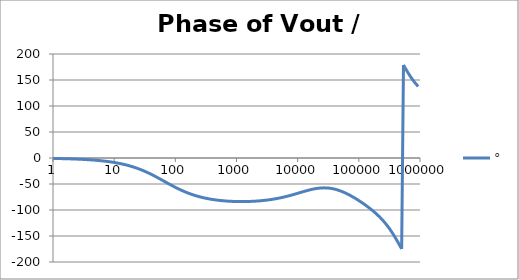
| Category | ° |
|---|---|
| 1.0 | -0.867 |
| 1.0715193052376064 | -0.929 |
| 1.1481536214968828 | -0.996 |
| 1.2302687708123814 | -1.067 |
| 1.318256738556407 | -1.143 |
| 1.4125375446227544 | -1.225 |
| 1.513561248436208 | -1.312 |
| 1.6218100973589298 | -1.406 |
| 1.7378008287493754 | -1.507 |
| 1.8620871366628673 | -1.614 |
| 1.9952623149688797 | -1.73 |
| 2.1379620895022318 | -1.853 |
| 2.2908676527677727 | -1.986 |
| 2.45470891568503 | -2.128 |
| 2.6302679918953817 | -2.28 |
| 2.8183829312644537 | -2.443 |
| 3.0199517204020156 | -2.617 |
| 3.235936569296282 | -2.804 |
| 3.467368504525316 | -3.004 |
| 3.7153522909717256 | -3.219 |
| 3.9810717055349727 | -3.448 |
| 4.265795188015926 | -3.694 |
| 4.570881896148749 | -3.958 |
| 4.897788193684462 | -4.24 |
| 5.2480746024977245 | -4.542 |
| 5.62341325190349 | -4.865 |
| 6.025595860743575 | -5.211 |
| 6.456542290346554 | -5.581 |
| 6.918309709189363 | -5.978 |
| 7.4131024130091765 | -6.402 |
| 7.943282347242814 | -6.855 |
| 8.511380382023765 | -7.34 |
| 9.120108393559095 | -7.859 |
| 9.772372209558105 | -8.413 |
| 10.47128548050899 | -9.005 |
| 11.22018454301963 | -9.637 |
| 12.022644346174127 | -10.312 |
| 12.88249551693134 | -11.032 |
| 13.803842646028851 | -11.799 |
| 14.791083881682074 | -12.617 |
| 15.848931924611136 | -13.487 |
| 16.98243652461744 | -14.412 |
| 18.197008586099834 | -15.395 |
| 19.498445997580447 | -16.438 |
| 20.892961308540382 | -17.543 |
| 22.387211385683386 | -18.713 |
| 23.988329190194897 | -19.948 |
| 25.703957827688622 | -21.249 |
| 27.54228703338165 | -22.619 |
| 29.51209226666385 | -24.057 |
| 31.62277660168379 | -25.562 |
| 33.884415613920254 | -27.133 |
| 36.307805477010106 | -28.769 |
| 38.90451449942804 | -30.466 |
| 41.686938347033525 | -32.22 |
| 44.6683592150963 | -34.026 |
| 47.86300923226381 | -35.879 |
| 51.28613839913647 | -37.771 |
| 54.95408738576247 | -39.695 |
| 58.88436553555889 | -41.642 |
| 63.09573444801931 | -43.604 |
| 67.60829753919813 | -45.571 |
| 72.44359600749901 | -47.534 |
| 77.62471166286915 | -49.483 |
| 83.17637711026705 | -51.409 |
| 89.12509381337456 | -53.303 |
| 95.49925860214357 | -55.158 |
| 102.32929922807544 | -56.967 |
| 109.64781961431841 | -58.723 |
| 117.48975549395293 | -60.421 |
| 125.89254117941665 | -62.057 |
| 134.89628825916537 | -63.628 |
| 144.54397707459273 | -65.13 |
| 154.88166189124806 | -66.564 |
| 165.95869074375608 | -67.927 |
| 177.82794100389225 | -69.22 |
| 190.5460717963248 | -70.443 |
| 204.17379446695278 | -71.597 |
| 218.77616239495524 | -72.685 |
| 234.42288153199212 | -73.706 |
| 251.18864315095806 | -74.664 |
| 269.15348039269156 | -75.561 |
| 288.4031503126605 | -76.398 |
| 309.0295432513591 | -77.179 |
| 331.1311214825911 | -77.904 |
| 354.81338923357566 | -78.578 |
| 380.18939632056095 | -79.201 |
| 407.3802778041123 | -79.776 |
| 436.5158322401654 | -80.306 |
| 467.7351412871979 | -80.791 |
| 501.18723362727184 | -81.235 |
| 537.0317963702526 | -81.639 |
| 575.4399373371566 | -82.003 |
| 616.5950018614822 | -82.331 |
| 660.6934480075952 | -82.623 |
| 707.9457843841375 | -82.881 |
| 758.5775750291831 | -83.105 |
| 812.8305161640983 | -83.297 |
| 870.9635899560801 | -83.458 |
| 933.2543007969903 | -83.587 |
| 999.9999999999998 | -83.687 |
| 1071.5193052376057 | -83.757 |
| 1148.1536214968828 | -83.797 |
| 1230.2687708123801 | -83.808 |
| 1318.2567385564053 | -83.79 |
| 1412.537544622753 | -83.743 |
| 1513.5612484362066 | -83.666 |
| 1621.8100973589292 | -83.56 |
| 1737.8008287493742 | -83.424 |
| 1862.0871366628671 | -83.258 |
| 1995.2623149688786 | -83.06 |
| 2137.9620895022326 | -82.831 |
| 2290.867652767771 | -82.569 |
| 2454.708915685027 | -82.274 |
| 2630.26799189538 | -81.945 |
| 2818.382931264451 | -81.58 |
| 3019.9517204020176 | -81.179 |
| 3235.9365692962774 | -80.74 |
| 3467.368504525316 | -80.263 |
| 3715.352290971724 | -79.746 |
| 3981.07170553497 | -79.189 |
| 4265.795188015923 | -78.59 |
| 4570.881896148745 | -77.948 |
| 4897.788193684463 | -77.264 |
| 5248.074602497726 | -76.537 |
| 5623.413251903489 | -75.767 |
| 6025.595860743574 | -74.955 |
| 6456.54229034655 | -74.102 |
| 6918.309709189357 | -73.209 |
| 7413.102413009165 | -72.279 |
| 7943.282347242815 | -71.315 |
| 8511.380382023763 | -70.321 |
| 9120.108393559092 | -69.304 |
| 9772.3722095581 | -68.268 |
| 10471.285480509003 | -67.221 |
| 11220.184543019639 | -66.173 |
| 12022.64434617411 | -65.131 |
| 12882.495516931338 | -64.107 |
| 13803.842646028841 | -63.113 |
| 14791.083881682063 | -62.159 |
| 15848.931924611119 | -61.259 |
| 16982.436524617453 | -60.426 |
| 18197.008586099837 | -59.671 |
| 19498.445997580417 | -59.008 |
| 20892.961308540387 | -58.449 |
| 22387.211385683382 | -58.004 |
| 23988.32919019488 | -57.683 |
| 25703.957827688606 | -57.496 |
| 27542.28703338167 | -57.449 |
| 29512.092266663854 | -57.55 |
| 31622.77660168378 | -57.801 |
| 33884.41561392023 | -58.206 |
| 36307.805477010166 | -58.765 |
| 38904.514499428085 | -59.479 |
| 41686.93834703348 | -60.344 |
| 44668.35921509631 | -61.358 |
| 47863.00923226382 | -62.516 |
| 51286.13839913646 | -63.81 |
| 54954.08738576241 | -65.235 |
| 58884.365535558936 | -66.783 |
| 63095.73444801934 | -68.445 |
| 67608.29753919817 | -70.213 |
| 72443.59600749899 | -72.08 |
| 77624.71166286913 | -74.037 |
| 83176.37711026703 | -76.078 |
| 89125.09381337445 | -78.198 |
| 95499.25860214363 | -80.392 |
| 102329.29922807543 | -82.657 |
| 109647.81961431848 | -84.993 |
| 117489.75549395289 | -87.399 |
| 125892.54117941685 | -89.88 |
| 134896.28825916522 | -92.44 |
| 144543.97707459255 | -95.085 |
| 154881.66189124787 | -97.826 |
| 165958.69074375575 | -100.674 |
| 177827.9410038922 | -103.642 |
| 190546.07179632425 | -106.747 |
| 204173.79446695274 | -110.009 |
| 218776.16239495497 | -113.447 |
| 234422.88153199226 | -117.086 |
| 251188.64315095753 | -120.95 |
| 269153.480392691 | -125.065 |
| 288403.15031266044 | -129.454 |
| 309029.5432513582 | -134.14 |
| 331131.1214825907 | -139.138 |
| 354813.3892335749 | -144.454 |
| 380189.3963205612 | -150.078 |
| 407380.2778041119 | -155.982 |
| 436515.8322401649 | -162.117 |
| 467735.14128719777 | -168.412 |
| 501187.2336272717 | -174.778 |
| 537031.7963702519 | 178.884 |
| 575439.9373371559 | 172.672 |
| 616595.001861482 | 166.675 |
| 660693.4480075944 | 160.963 |
| 707945.7843841374 | 155.584 |
| 758577.575029183 | 150.565 |
| 812830.5161640996 | 145.914 |
| 870963.5899560791 | 141.626 |
| 933254.3007969892 | 137.686 |